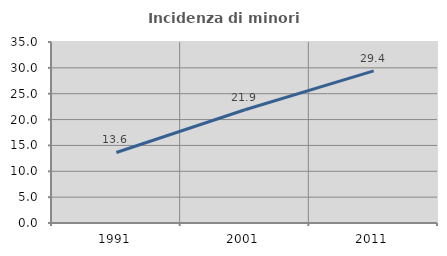
| Category | Incidenza di minori stranieri |
|---|---|
| 1991.0 | 13.636 |
| 2001.0 | 21.905 |
| 2011.0 | 29.429 |